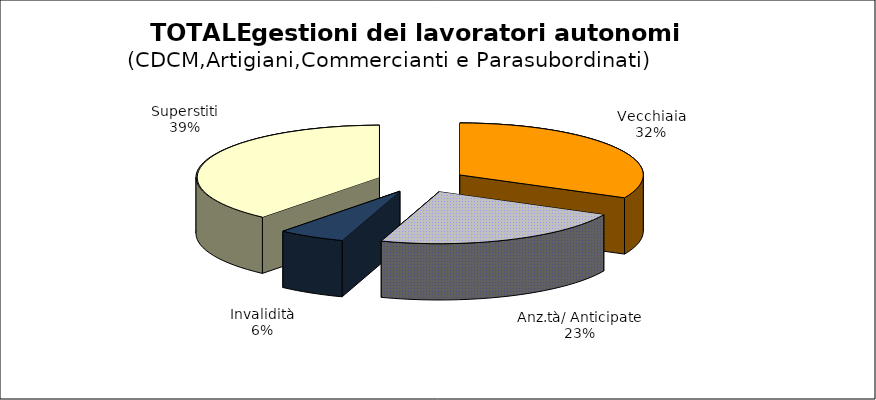
| Category | Series 0 |
|---|---|
| Vecchiaia | 13530 |
| Anz.tà/ Anticipate | 9582 |
| Invalidità | 2479 |
| Superstiti | 16352 |